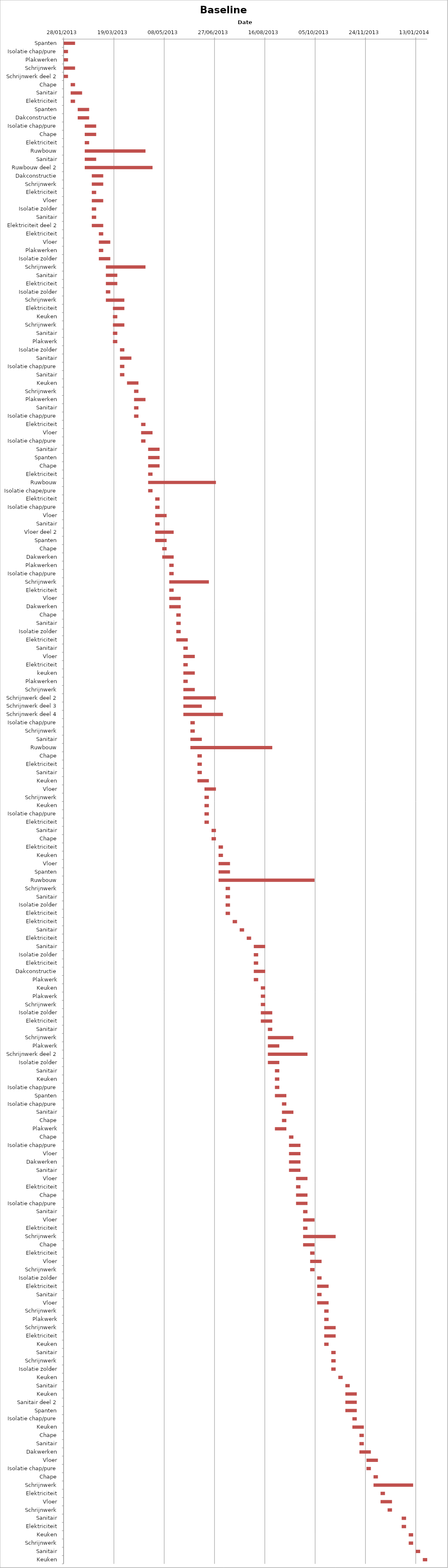
| Category | Baseline start | Actual duration |
|---|---|---|
| Spanten | 41302.333 | 11.375 |
| Isolatie chap/pure | 41302.333 | 4.375 |
| Plakwerken | 41302.333 | 4.375 |
| Schrijnwerk | 41302.333 | 11.375 |
| Schrijnwerk deel 2 | 41302.333 | 4.375 |
| Chape | 41309.333 | 4.375 |
| Sanitair | 41309.333 | 11.375 |
| Elektriciteit | 41309.333 | 4.375 |
| Spanten | 41316.333 | 11.375 |
| Dakconstructie | 41316.333 | 11.375 |
| Isolatie chap/pure | 41323.333 | 11.375 |
| Chape | 41323.333 | 11.375 |
| Elektriciteit | 41323.333 | 4.375 |
| Ruwbouw | 41323.333 | 60.375 |
| Sanitair | 41323.333 | 11.375 |
| Ruwbouw deel 2 | 41323.333 | 67.375 |
| Dakconstructie | 41330.333 | 11.375 |
| Schrijnwerk | 41330.333 | 11.375 |
| Elektriciteit | 41330.333 | 4.375 |
| Vloer | 41330.333 | 11.375 |
| Isolatie zolder | 41330.333 | 4.375 |
| Sanitair | 41330.333 | 4.375 |
| Elektriciteit deel 2 | 41330.333 | 11.375 |
| Elektriciteit | 41337.333 | 4.375 |
| Vloer | 41337.333 | 11.375 |
| Plakwerken | 41337.333 | 4.375 |
| Isolatie zolder | 41337.333 | 11.375 |
| Schrijnwerk | 41344.333 | 39.375 |
| Sanitair | 41344.333 | 11.375 |
| Elektriciteit | 41344.333 | 11.375 |
| Isolatie zolder | 41344.333 | 4.375 |
| Schrijnwerk | 41344.333 | 18.375 |
| Elektriciteit | 41351.333 | 11.375 |
| Keuken | 41351.333 | 4.375 |
| Schrijnwerk | 41351.333 | 11.375 |
| Sanitair | 41351.333 | 4.375 |
| Plakwerk | 41351.333 | 4.375 |
| Isolatie zolder | 41358.333 | 4.375 |
| Sanitair | 41358.333 | 11.375 |
| Isolatie chap/pure | 41358.333 | 4.375 |
| Sanitair | 41358.333 | 4.375 |
| Keuken | 41365.333 | 11.375 |
| Schrijnwerk | 41372.333 | 4.375 |
| Plakwerken | 41372.333 | 11.375 |
| Sanitair | 41372.333 | 4.375 |
| Isolatie chap/pure | 41372.333 | 4.375 |
| Elektriciteit | 41379.333 | 4.375 |
| Vloer | 41379.333 | 11.375 |
| Isolatie chap/pure | 41379.333 | 4.375 |
| Sanitair | 41386.333 | 11.375 |
| Spanten | 41386.333 | 11.375 |
| Chape | 41386.333 | 11.375 |
| Elektriciteit | 41386.333 | 4.375 |
| Ruwbouw | 41386.333 | 67.375 |
| Isolatie chape/pure | 41386.333 | 4.375 |
| Elektriciteit | 41393.333 | 4.375 |
| Isolatie chap/pure | 41393.333 | 4.375 |
| Vloer | 41393.333 | 11.375 |
| Sanitair | 41393.333 | 4.375 |
| Vloer deel 2 | 41393.333 | 18.375 |
| Spanten | 41393.333 | 11.375 |
| Chape | 41400.333 | 4.375 |
| Dakwerken | 41400.333 | 11.375 |
| Plakwerken | 41407.333 | 4.375 |
| Isolatie chap/pure | 41407.333 | 4.375 |
| Schrijnwerk | 41407.333 | 39.375 |
| Elektriciteit | 41407.333 | 4.375 |
| Vloer | 41407.333 | 11.375 |
| Dakwerken | 41407.333 | 11.375 |
| Chape | 41414.333 | 4.375 |
| Sanitair | 41414.333 | 4.375 |
| Isolatie zolder | 41414.333 | 4.375 |
| Elektriciteit | 41414.333 | 11.375 |
| Sanitair | 41421.333 | 4.375 |
| Vloer | 41421.333 | 11.375 |
| Elektriciteit | 41421.333 | 4.375 |
| keuken | 41421.333 | 11.375 |
| Plakwerken | 41421.333 | 4.375 |
| Schrijnwerk | 41421.333 | 11.375 |
| Schrijnwerk deel 2 | 41421.333 | 32.375 |
| Schrijnwerk deel 3 | 41421.333 | 18.375 |
| Schrijnwerk deel 4 | 41421.333 | 39.375 |
| Isolatie chap/pure | 41428.333 | 4.375 |
| Schrijnwerk | 41428.333 | 4.375 |
| Sanitair | 41428.333 | 11.375 |
| Ruwbouw | 41428.333 | 81.375 |
| Chape | 41435.333 | 4.375 |
| Elektriciteit | 41435.333 | 4.375 |
| Sanitair | 41435.333 | 4.375 |
| Keuken | 41435.333 | 11.375 |
| Vloer | 41442.333 | 11.375 |
| Schrijnwerk | 41442.333 | 4.375 |
| Keuken | 41442.333 | 4.375 |
| Isolatie chap/pure | 41442.333 | 4.375 |
| Elektriciteit | 41442.333 | 4.375 |
| Sanitair | 41449.333 | 4.375 |
| Chape | 41449.333 | 4.375 |
| Elektriciteit | 41456.333 | 4.375 |
| Keuken | 41456.333 | 4.375 |
| Vloer | 41456.333 | 11.375 |
| Spanten | 41456.333 | 11.375 |
| Ruwbouw | 41456.333 | 95.375 |
| Schrijnwerk | 41463.333 | 4.375 |
| Sanitair | 41463.333 | 4.375 |
| Isolatie zolder | 41463.333 | 4.375 |
| Elektriciteit | 41463.333 | 4.375 |
| Elektriciteit | 41470.333 | 4.375 |
| Sanitair | 41477.333 | 4.375 |
| Elektriciteit | 41484.333 | 4.375 |
| Sanitair | 41491.333 | 11.375 |
| Isolatie zolder | 41491.333 | 4.375 |
| Elektriciteit | 41491.333 | 4.375 |
| Dakconstructie | 41491.333 | 11.375 |
| Plakwerk | 41491.333 | 4.375 |
| Keuken | 41498.333 | 4.375 |
| Plakwerk | 41498.333 | 4.375 |
| Schrijnwerk | 41498.333 | 4.375 |
| Isolatie zolder | 41498.333 | 11.375 |
| Elektriciteit | 41498.333 | 11.375 |
| Sanitair | 41505.333 | 4.375 |
| Schrijnwerk | 41505.333 | 25.375 |
| Plakwerk | 41505.333 | 11.375 |
| Schrijnwerk deel 2 | 41505.333 | 39.375 |
| Isolatie zolder | 41505.333 | 11.375 |
| Sanitair | 41512.333 | 4.375 |
| Keuken | 41512.333 | 4.375 |
| Isolatie chap/pure | 41512.333 | 4.375 |
| Spanten | 41512.333 | 11.375 |
| Isolatie chap/pure | 41519.333 | 4.375 |
| Sanitair | 41519.333 | 11.375 |
| Chape | 41519.333 | 4.375 |
| Plakwerk | 41512.333 | 11.375 |
| Chape | 41526.333 | 4.375 |
| Isolatie chap/pure | 41526.333 | 11.375 |
| Vloer | 41526.333 | 11.375 |
| Dakwerken | 41526.333 | 11.375 |
| Sanitair | 41526.333 | 11.375 |
| Vloer | 41533.333 | 11.375 |
| Elektriciteit | 41533.333 | 4.375 |
| Chape | 41533.333 | 11.375 |
| Isolatie chap/pure | 41533.333 | 11.375 |
| Sanitair | 41540.333 | 4.375 |
| Vloer | 41540.333 | 11.375 |
| Elektriciteit | 41540.333 | 4.375 |
| Schrijnwerk | 41540.333 | 32.375 |
| Chape | 41540.333 | 11.375 |
| Elektriciteit | 41547.333 | 4.375 |
| Vloer | 41547.333 | 11.375 |
| Schrijnwerk | 41547.333 | 4.375 |
| Isolatie zolder | 41554.333 | 4.375 |
| Elektriciteit | 41554.333 | 11.375 |
| Sanitair | 41554.333 | 4.375 |
| Vloer | 41554.333 | 11.375 |
| Schrijnwerk | 41561.333 | 4.375 |
| Plakwerk | 41561.333 | 4.375 |
| Schrijnwerk | 41561.333 | 11.375 |
| Elektriciteit | 41561.333 | 11.375 |
| Keuken | 41561.333 | 4.375 |
| Sanitair | 41568.333 | 4.375 |
| Schrijnwerk | 41568.333 | 4.375 |
| Isolatie zolder | 41568.333 | 4.375 |
| Keuken | 41575.333 | 4.375 |
| Sanitair | 41582.333 | 4.375 |
| Keuken | 41582.333 | 11.375 |
| Sanitair deel 2 | 41582.333 | 11.375 |
| Spanten | 41582.333 | 11.375 |
| Isolatie chap/pure | 41589.333 | 4.375 |
| Keuken | 41589.333 | 11.375 |
| Chape | 41596.333 | 4.375 |
| Sanitair | 41596.333 | 4.375 |
| Dakwerken | 41596.333 | 11.375 |
| Vloer | 41603.333 | 11.375 |
| Isolatie chap/pure | 41603.333 | 4.375 |
| Chape | 41610.333 | 4.375 |
| Schrijnwerk | 41610.333 | 39.375 |
| Elektriciteit | 41617.333 | 4.375 |
| Vloer | 41617.333 | 11.375 |
| Schrijnwerk | 41624.333 | 4.375 |
| Sanitair | 41638.333 | 4.375 |
| Elektriciteit | 41638.333 | 4.375 |
| Keuken | 41645.333 | 4.375 |
| Schrijnwerk | 41645.333 | 4.375 |
| Sanitair | 41652.333 | 4.375 |
| Keuken | 41659.333 | 4.375 |